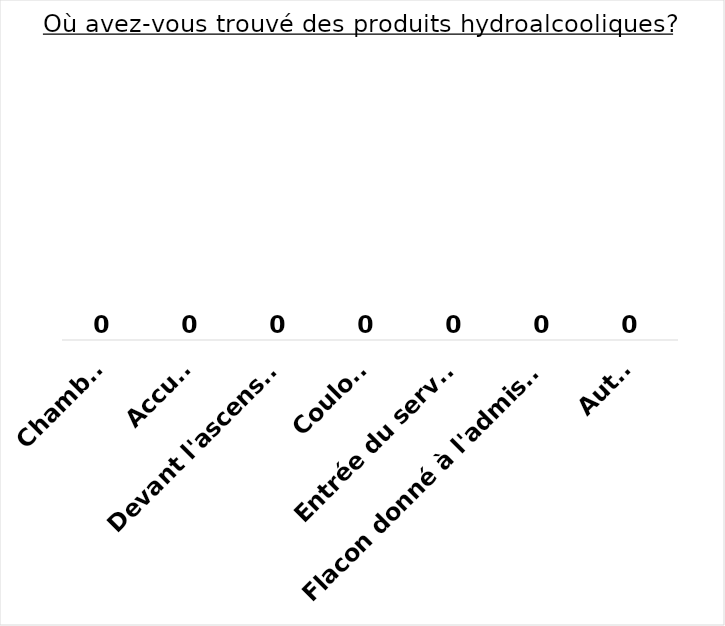
| Category | Series 0 |
|---|---|
| Chambre | 0 |
| Accueil | 0 |
| Devant l'ascenseur | 0 |
| Couloir | 0 |
| Entrée du service | 0 |
| Flacon donné à l'admission | 0 |
| Autre | 0 |